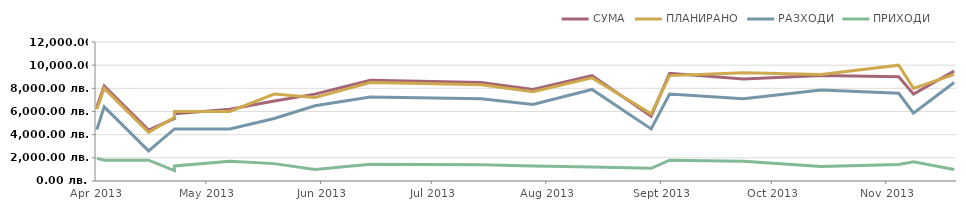
| Category | СУМА | ПЛАНИРАНО | РАЗХОДИ | ПРИХОДИ |
|---|---|---|---|---|
| 2013-04-23 | 6400 | 6200 | 4450 | 1950 |
| 2013-04-25 | 8200 | 8000 | 6400 | 1800 |
| 2013-05-07 | 4400 | 4200 | 2600 | 1800 |
| 2013-05-14 | 5400 | 5500 | 4500 | 900 |
| 2013-05-14 | 5800 | 6000 | 4500 | 1300 |
| 2013-05-29 | 6200 | 6000 | 4500 | 1700 |
| 2013-06-10 | 6900 | 7500 | 5400 | 1500 |
| 2013-06-21 | 7500 | 7200 | 6500 | 1000 |
| 2013-07-06 | 8700 | 8500 | 7250 | 1450 |
| 2013-08-05 | 8500 | 8300 | 7100 | 1400 |
| 2013-08-19 | 7900 | 7700 | 6600 | 1300 |
| 2013-09-04 | 9100 | 8900 | 7900 | 1200 |
| 2013-09-20 | 5600 | 5800 | 4500 | 1100 |
| 2013-09-25 | 9300 | 9100 | 7500 | 1800 |
| 2013-10-15 | 8800 | 9350 | 7100 | 1700 |
| 2013-11-05 | 9100 | 9200 | 7850 | 1250 |
| 2013-11-26 | 9000 | 10000 | 7575 | 1425 |
| 2013-11-30 | 7500 | 8000 | 5850 | 1650 |
| 2013-12-11 | 9500 | 9200 | 8500 | 1000 |